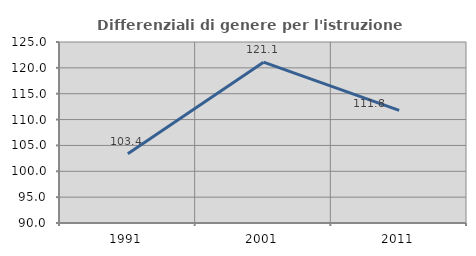
| Category | Differenziali di genere per l'istruzione superiore |
|---|---|
| 1991.0 | 103.377 |
| 2001.0 | 121.096 |
| 2011.0 | 111.792 |